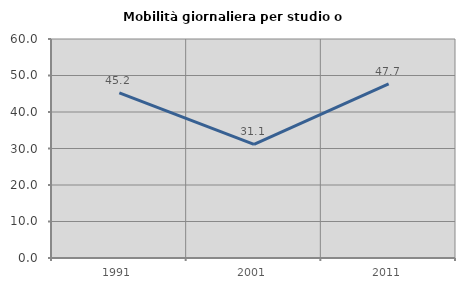
| Category | Mobilità giornaliera per studio o lavoro |
|---|---|
| 1991.0 | 45.238 |
| 2001.0 | 31.111 |
| 2011.0 | 47.674 |